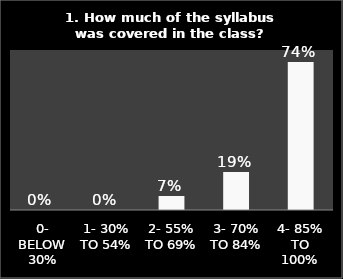
| Category | Series 0 |
|---|---|
| 0- BELOW 30% | 0 |
| 1- 30% TO 54% | 0 |
| 2- 55% TO 69% | 0.07 |
| 3- 70% TO 84% | 0.19 |
| 4- 85% TO 100% | 0.74 |